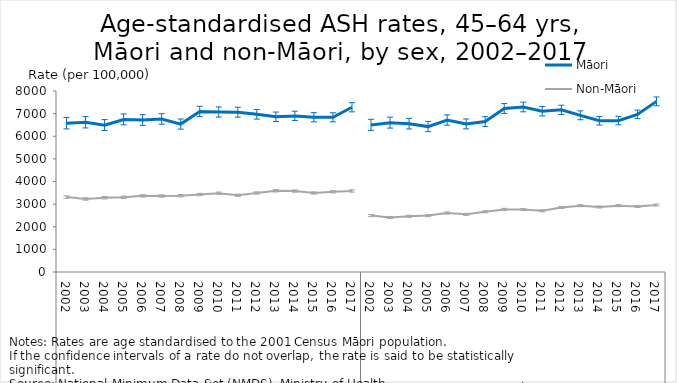
| Category | Māori | Non-Māori |
|---|---|---|
| 0 | 6573.89 | 3312.662 |
| 1 | 6613.679 | 3225.772 |
| 2 | 6490.678 | 3282.581 |
| 3 | 6742.059 | 3300.897 |
| 4 | 6715.132 | 3365.893 |
| 5 | 6762.113 | 3359.184 |
| 6 | 6536.02 | 3372.695 |
| 7 | 7093.74 | 3424.325 |
| 8 | 7069.181 | 3481.666 |
| 9 | 7060.589 | 3391.189 |
| 10 | 6969.411 | 3492.654 |
| 11 | 6858.434 | 3589.196 |
| 12 | 6899.939 | 3575.764 |
| 13 | 6837.806 | 3491.833 |
| 14 | 6835.247 | 3544.668 |
| 15 | 7279.666 | 3582.07 |
| 16 | 6501.691 | 2493.363 |
| 17 | 6597.817 | 2410.194 |
| 18 | 6552.85 | 2463.043 |
| 19 | 6426.625 | 2492.663 |
| 20 | 6713.966 | 2609.526 |
| 21 | 6542.555 | 2547.475 |
| 22 | 6647.71 | 2662.701 |
| 23 | 7223.081 | 2767.322 |
| 24 | 7292.572 | 2758.086 |
| 25 | 7102.348 | 2704.089 |
| 26 | 7165.809 | 2849.664 |
| 27 | 6923.837 | 2932.463 |
| 28 | 6682.691 | 2873.995 |
| 29 | 6689.337 | 2933.001 |
| 30 | 6965.139 | 2898.485 |
| 31 | 7540.92 | 2961.916 |